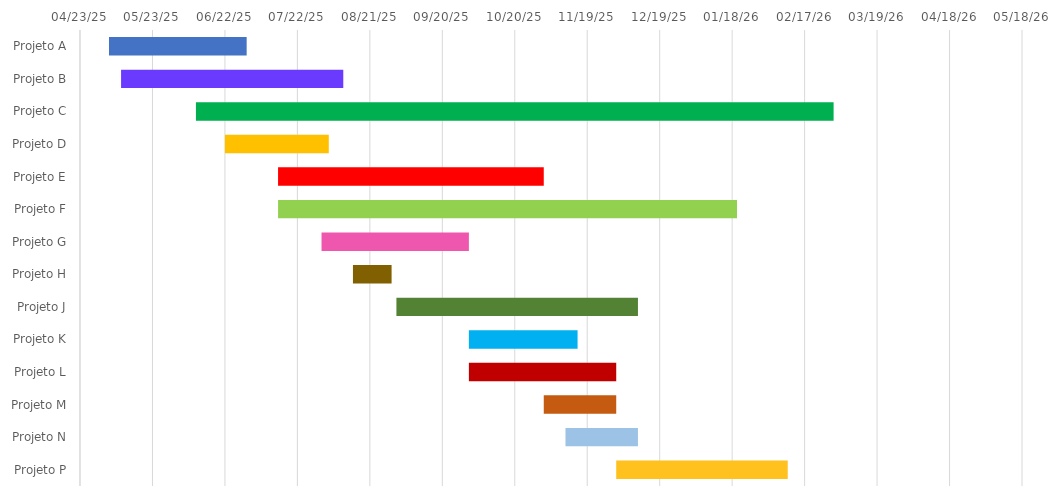
| Category | INÍCIO | Duração |
|---|---|---|
| Projeto A | 2025-05-05 | 57 |
| Projeto B | 2025-05-10 | 92 |
| Projeto C | 2025-06-10 | 264 |
| Projeto D | 2025-06-22 | 43 |
| Projeto E | 2025-07-14 | 110 |
| Projeto F | 2025-07-14 | 190 |
| Projeto G | 2025-08-01 | 61 |
| Projeto H | 2025-08-14 | 16 |
| Projeto J | 2025-09-01 | 100 |
| Projeto K | 2025-10-01 | 45 |
| Projeto L | 2025-10-01 | 61 |
| Projeto M | 2025-11-01 | 30 |
| Projeto N | 2025-11-10 | 30 |
| Projeto P | 2025-12-01 | 71 |